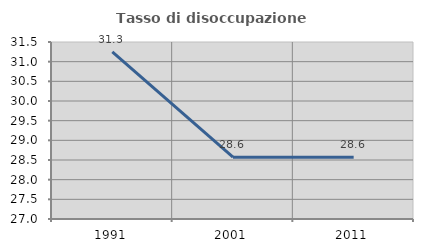
| Category | Tasso di disoccupazione giovanile  |
|---|---|
| 1991.0 | 31.25 |
| 2001.0 | 28.571 |
| 2011.0 | 28.571 |